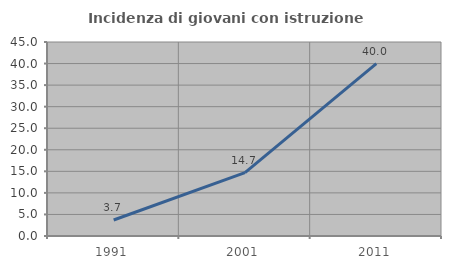
| Category | Incidenza di giovani con istruzione universitaria |
|---|---|
| 1991.0 | 3.704 |
| 2001.0 | 14.706 |
| 2011.0 | 40 |